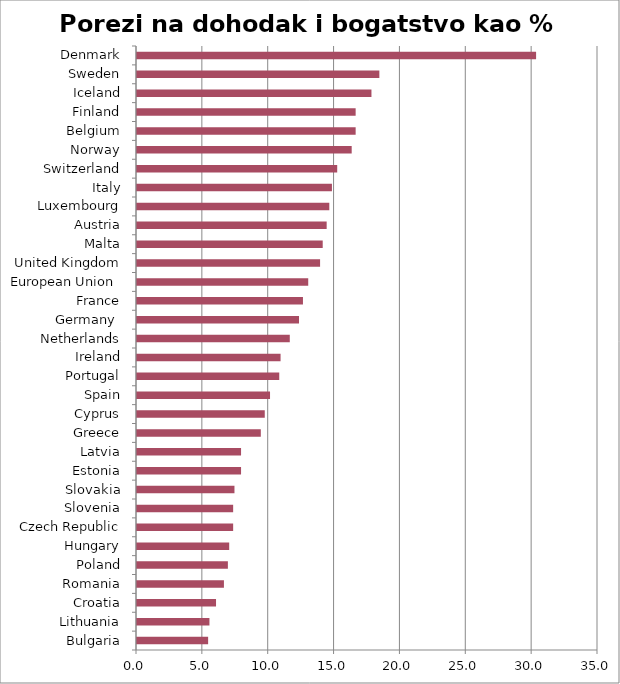
| Category | Porezi na dohodak i bogatstvo kao % BDP-a, 2015 |
|---|---|
| Bulgaria | 5.4 |
| Lithuania | 5.5 |
| Croatia | 6 |
| Romania | 6.6 |
| Poland | 6.9 |
| Hungary | 7 |
| Czech Republic | 7.3 |
| Slovenia | 7.3 |
| Slovakia | 7.4 |
| Estonia | 7.9 |
| Latvia | 7.9 |
| Greece | 9.4 |
| Cyprus | 9.7 |
| Spain | 10.1 |
| Portugal | 10.8 |
| Ireland | 10.9 |
| Netherlands | 11.6 |
| Germany  | 12.3 |
| France | 12.6 |
| European Union  | 13 |
| United Kingdom | 13.9 |
| Malta | 14.1 |
| Austria | 14.4 |
| Luxembourg | 14.6 |
| Italy | 14.8 |
| Switzerland | 15.2 |
| Norway | 16.3 |
| Belgium | 16.6 |
| Finland | 16.6 |
| Iceland | 17.8 |
| Sweden | 18.4 |
| Denmark | 30.3 |